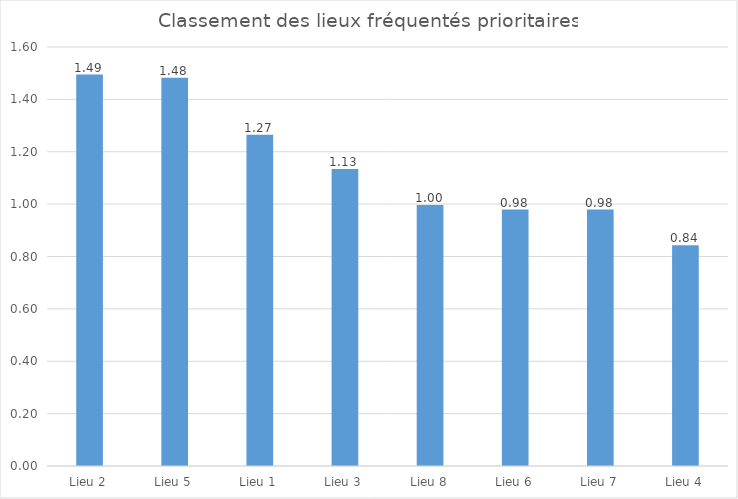
| Category | Score |
|---|---|
| Lieu 2 | 1.495 |
| Lieu 5 | 1.482 |
| Lieu 1 | 1.265 |
| Lieu 3 | 1.134 |
| Lieu 8 | 0.997 |
| Lieu 6 | 0.979 |
| Lieu 7 | 0.979 |
| Lieu 4 | 0.842 |